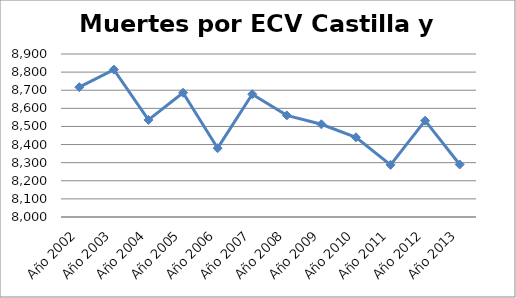
| Category | Series 0 |
|---|---|
| Año 2002 | 8717 |
| Año 2003 | 8814 |
| Año 2004 | 8536 |
| Año 2005 | 8686 |
| Año 2006 | 8380 |
| Año 2007 | 8678 |
| Año 2008 | 8561 |
| Año 2009 | 8512 |
| Año 2010 | 8440 |
| Año 2011 | 8288 |
| Año 2012 | 8532 |
| Año 2013 | 8290 |